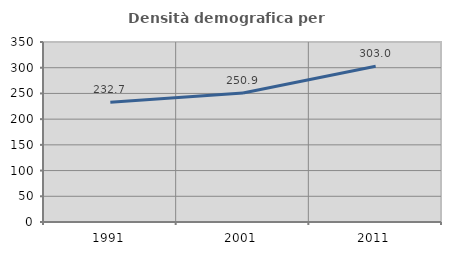
| Category | Densità demografica |
|---|---|
| 1991.0 | 232.749 |
| 2001.0 | 250.884 |
| 2011.0 | 302.97 |